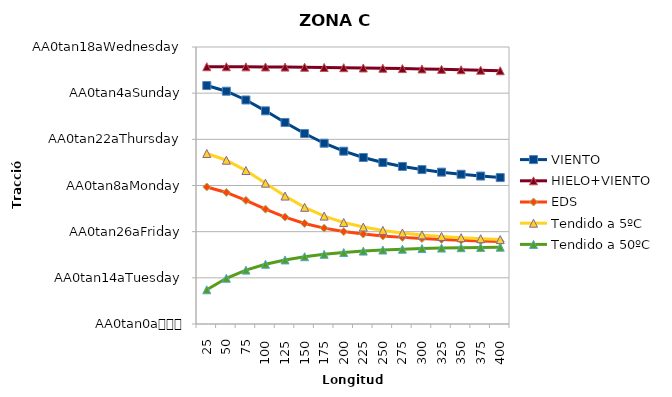
| Category | VIENTO | HIELO+VIENTO | EDS | Tendido a 5ºC | Tendido a 50ºC |
|---|---|---|---|---|---|
| 25 | 2582.45 | 2786.499 | 1484.119 | 1846.332 | 370.48 |
| 50 | 2521.164 | 2785.995 | 1424.92 | 1773.903 | 495.46 |
| 75 | 2426.251 | 2785.155 | 1338.962 | 1661.833 | 583.581 |
| 100 | 2308.717 | 2783.978 | 1244.057 | 1525.175 | 647.229 |
| 125 | 2182.826 | 2782.464 | 1157.751 | 1385.552 | 693.919 |
| 150 | 2062.645 | 2780.61 | 1089.154 | 1263.581 | 728.593 |
| 175 | 1957.781 | 2778.417 | 1038.317 | 1168.863 | 754.627 |
| 200 | 1871.667 | 2775.881 | 1001.358 | 1099.63 | 774.37 |
| 225 | 1803.174 | 2773.002 | 974.232 | 1049.677 | 789.468 |
| 250 | 1749.232 | 2769.777 | 953.876 | 1013.156 | 801.088 |
| 275 | 1706.572 | 2766.204 | 938.191 | 985.807 | 810.066 |
| 300 | 1672.426 | 2762.28 | 925.767 | 964.768 | 817.005 |
| 325 | 1644.657 | 2758.002 | 915.661 | 948.144 | 822.346 |
| 350 | 1621.669 | 2753.366 | 907.226 | 934.671 | 826.415 |
| 375 | 1602.291 | 2748.37 | 900.013 | 923.487 | 829.456 |
| 400 | 1585.658 | 2743.008 | 893.705 | 913.992 | 831.654 |